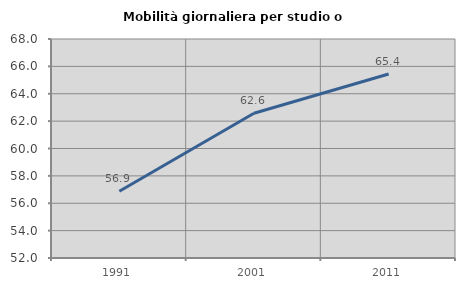
| Category | Mobilità giornaliera per studio o lavoro |
|---|---|
| 1991.0 | 56.874 |
| 2001.0 | 62.58 |
| 2011.0 | 65.445 |